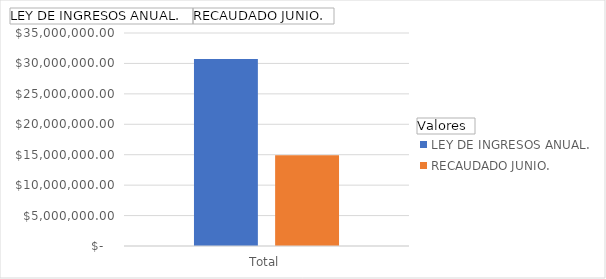
| Category | LEY DE INGRESOS ANUAL. | RECAUDADO JUNIO. |
|---|---|---|
| Total | 30714625 | 14892670.63 |